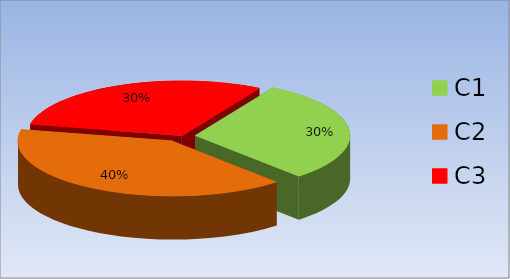
| Category | Graphique criticité par service |
|---|---|
| C1 | 3 |
| C2 | 4 |
| C3 | 3 |